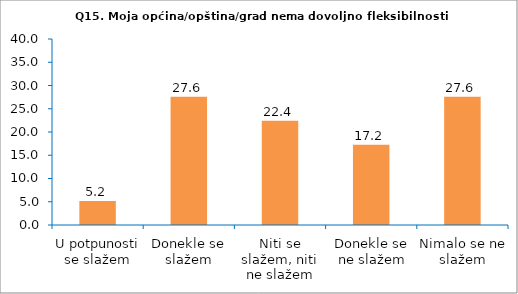
| Category | Series 0 |
|---|---|
| U potpunosti se slažem | 5.172 |
| Donekle se slažem | 27.586 |
| Niti se slažem, niti ne slažem | 22.414 |
| Donekle se ne slažem | 17.241 |
| Nimalo se ne slažem | 27.586 |